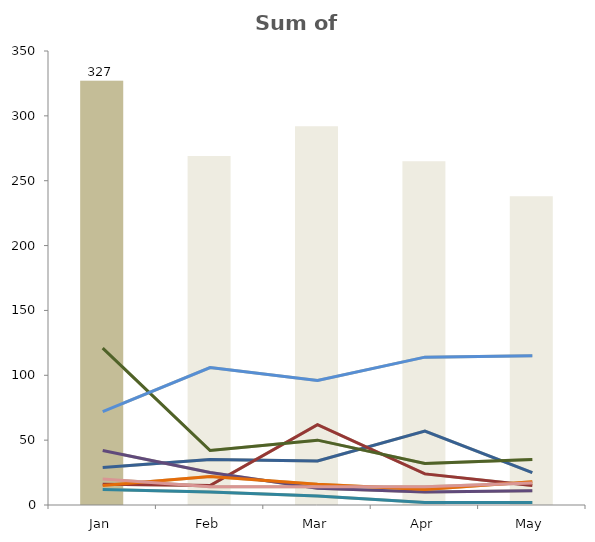
| Category | Total |
|---|---|
| 0 | 327 |
| 1 | 0 |
| 2 | 0 |
| 3 | 0 |
| 4 | 0 |